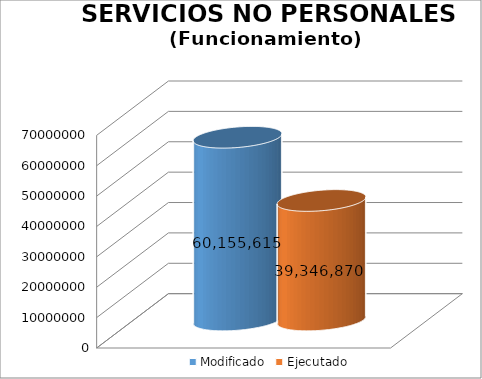
| Category | Modificado | Ejecutado |
|---|---|---|
| 0 | 60155615 | 39346869.99 |